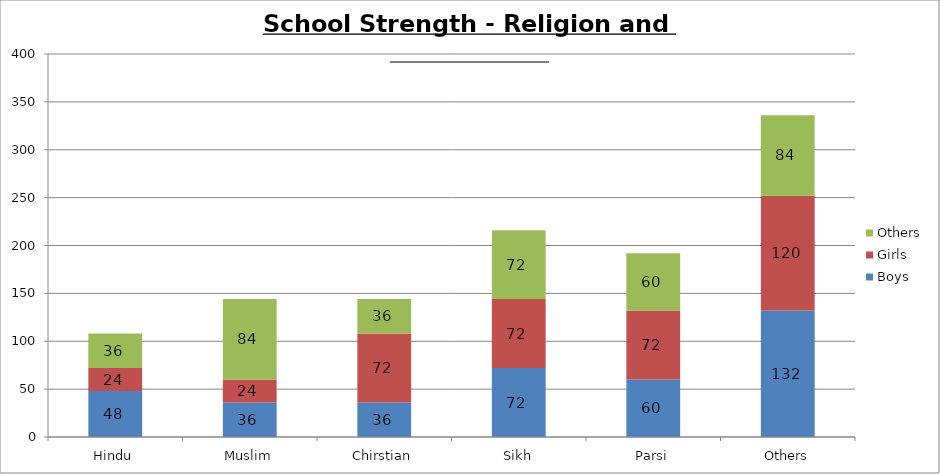
| Category | Boys | Girls | Others |
|---|---|---|---|
| Hindu | 48 | 24 | 36 |
| Muslim | 36 | 24 | 84 |
| Chirstian | 36 | 72 | 36 |
| Sikh | 72 | 72 | 72 |
| Parsi | 60 | 72 | 60 |
| Others | 132 | 120 | 84 |